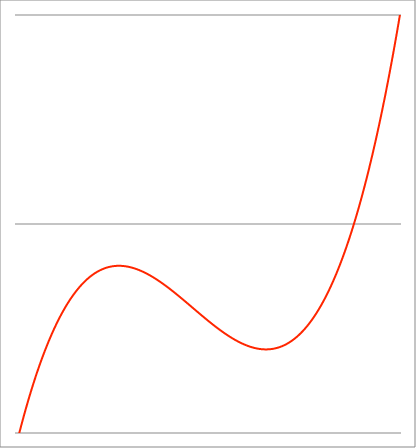
| Category | Series 1 |
|---|---|
| -3.4 | -1.062 |
| -3.397375 | -1.059 |
| -3.39475 | -1.055 |
| -3.392125 | -1.051 |
| -3.389499999999999 | -1.047 |
| -3.386874999999999 | -1.044 |
| -3.384249999999999 | -1.04 |
| -3.381624999999999 | -1.036 |
| -3.378999999999999 | -1.033 |
| -3.376374999999999 | -1.029 |
| -3.373749999999999 | -1.025 |
| -3.371124999999999 | -1.022 |
| -3.368499999999999 | -1.018 |
| -3.365874999999999 | -1.015 |
| -3.363249999999998 | -1.011 |
| -3.360624999999998 | -1.007 |
| -3.357999999999998 | -1.004 |
| -3.355374999999998 | -1 |
| -3.352749999999998 | -0.997 |
| -3.350124999999998 | -0.993 |
| -3.347499999999998 | -0.989 |
| -3.344874999999998 | -0.986 |
| -3.342249999999998 | -0.982 |
| -3.339624999999998 | -0.979 |
| -3.336999999999997 | -0.975 |
| -3.334374999999997 | -0.972 |
| -3.331749999999997 | -0.968 |
| -3.329124999999997 | -0.965 |
| -3.326499999999997 | -0.961 |
| -3.323874999999997 | -0.958 |
| -3.321249999999997 | -0.954 |
| -3.318624999999997 | -0.951 |
| -3.315999999999997 | -0.947 |
| -3.313374999999997 | -0.944 |
| -3.310749999999996 | -0.941 |
| -3.308124999999996 | -0.937 |
| -3.305499999999996 | -0.934 |
| -3.302874999999996 | -0.93 |
| -3.300249999999996 | -0.927 |
| -3.297624999999996 | -0.924 |
| -3.294999999999996 | -0.92 |
| -3.292374999999996 | -0.917 |
| -3.289749999999996 | -0.914 |
| -3.287124999999995 | -0.91 |
| -3.284499999999996 | -0.907 |
| -3.281874999999995 | -0.904 |
| -3.279249999999995 | -0.9 |
| -3.276624999999995 | -0.897 |
| -3.273999999999995 | -0.894 |
| -3.271374999999995 | -0.89 |
| -3.268749999999995 | -0.887 |
| -3.266124999999995 | -0.884 |
| -3.263499999999995 | -0.881 |
| -3.260874999999995 | -0.877 |
| -3.258249999999995 | -0.874 |
| -3.255624999999994 | -0.871 |
| -3.252999999999994 | -0.868 |
| -3.250374999999994 | -0.865 |
| -3.247749999999994 | -0.861 |
| -3.245124999999994 | -0.858 |
| -3.242499999999994 | -0.855 |
| -3.239874999999994 | -0.852 |
| -3.237249999999994 | -0.849 |
| -3.234624999999994 | -0.845 |
| -3.231999999999994 | -0.842 |
| -3.229374999999993 | -0.839 |
| -3.226749999999993 | -0.836 |
| -3.224124999999993 | -0.833 |
| -3.221499999999993 | -0.83 |
| -3.218874999999993 | -0.827 |
| -3.216249999999993 | -0.824 |
| -3.213624999999993 | -0.821 |
| -3.210999999999993 | -0.818 |
| -3.208374999999992 | -0.814 |
| -3.205749999999993 | -0.811 |
| -3.203124999999992 | -0.808 |
| -3.200499999999992 | -0.805 |
| -3.197874999999992 | -0.802 |
| -3.195249999999992 | -0.799 |
| -3.192624999999992 | -0.796 |
| -3.189999999999992 | -0.793 |
| -3.187374999999992 | -0.79 |
| -3.184749999999992 | -0.787 |
| -3.182124999999992 | -0.784 |
| -3.179499999999992 | -0.781 |
| -3.176874999999991 | -0.779 |
| -3.174249999999991 | -0.776 |
| -3.171624999999991 | -0.773 |
| -3.168999999999991 | -0.77 |
| -3.166374999999991 | -0.767 |
| -3.163749999999991 | -0.764 |
| -3.161124999999991 | -0.761 |
| -3.158499999999991 | -0.758 |
| -3.155874999999991 | -0.755 |
| -3.153249999999991 | -0.752 |
| -3.15062499999999 | -0.75 |
| -3.14799999999999 | -0.747 |
| -3.14537499999999 | -0.744 |
| -3.14274999999999 | -0.741 |
| -3.14012499999999 | -0.738 |
| -3.13749999999999 | -0.735 |
| -3.13487499999999 | -0.733 |
| -3.13224999999999 | -0.73 |
| -3.12962499999999 | -0.727 |
| -3.12699999999999 | -0.724 |
| -3.124374999999989 | -0.721 |
| -3.121749999999989 | -0.719 |
| -3.119124999999989 | -0.716 |
| -3.116499999999989 | -0.713 |
| -3.113874999999989 | -0.71 |
| -3.111249999999989 | -0.708 |
| -3.108624999999989 | -0.705 |
| -3.105999999999989 | -0.702 |
| -3.103374999999989 | -0.7 |
| -3.100749999999989 | -0.697 |
| -3.098124999999988 | -0.694 |
| -3.095499999999988 | -0.692 |
| -3.092874999999988 | -0.689 |
| -3.090249999999988 | -0.686 |
| -3.087624999999988 | -0.684 |
| -3.084999999999988 | -0.681 |
| -3.082374999999988 | -0.678 |
| -3.079749999999988 | -0.676 |
| -3.077124999999988 | -0.673 |
| -3.074499999999988 | -0.67 |
| -3.071874999999987 | -0.668 |
| -3.069249999999987 | -0.665 |
| -3.066624999999987 | -0.663 |
| -3.063999999999987 | -0.66 |
| -3.061374999999987 | -0.658 |
| -3.058749999999987 | -0.655 |
| -3.056124999999987 | -0.652 |
| -3.053499999999987 | -0.65 |
| -3.050874999999987 | -0.647 |
| -3.048249999999987 | -0.645 |
| -3.045624999999986 | -0.642 |
| -3.042999999999986 | -0.64 |
| -3.040374999999986 | -0.637 |
| -3.037749999999986 | -0.635 |
| -3.035124999999986 | -0.632 |
| -3.032499999999986 | -0.63 |
| -3.029874999999986 | -0.627 |
| -3.027249999999986 | -0.625 |
| -3.024624999999986 | -0.623 |
| -3.021999999999986 | -0.62 |
| -3.019374999999985 | -0.618 |
| -3.016749999999985 | -0.615 |
| -3.014124999999985 | -0.613 |
| -3.011499999999985 | -0.61 |
| -3.008874999999985 | -0.608 |
| -3.006249999999985 | -0.606 |
| -3.003624999999985 | -0.603 |
| -3.000999999999985 | -0.601 |
| -2.998374999999985 | -0.599 |
| -2.995749999999985 | -0.596 |
| -2.993124999999984 | -0.594 |
| -2.990499999999984 | -0.592 |
| -2.987874999999984 | -0.589 |
| -2.985249999999984 | -0.587 |
| -2.982624999999984 | -0.585 |
| -2.979999999999984 | -0.582 |
| -2.977374999999984 | -0.58 |
| -2.974749999999984 | -0.578 |
| -2.972124999999984 | -0.575 |
| -2.969499999999984 | -0.573 |
| -2.966874999999983 | -0.571 |
| -2.964249999999983 | -0.569 |
| -2.961624999999983 | -0.566 |
| -2.958999999999983 | -0.564 |
| -2.956374999999983 | -0.562 |
| -2.953749999999983 | -0.56 |
| -2.951124999999983 | -0.557 |
| -2.948499999999983 | -0.555 |
| -2.945874999999983 | -0.553 |
| -2.943249999999983 | -0.551 |
| -2.940624999999982 | -0.549 |
| -2.937999999999982 | -0.546 |
| -2.935374999999982 | -0.544 |
| -2.932749999999982 | -0.542 |
| -2.930124999999982 | -0.54 |
| -2.927499999999982 | -0.538 |
| -2.924874999999982 | -0.536 |
| -2.922249999999982 | -0.534 |
| -2.919624999999982 | -0.531 |
| -2.916999999999982 | -0.529 |
| -2.914374999999981 | -0.527 |
| -2.911749999999981 | -0.525 |
| -2.909124999999981 | -0.523 |
| -2.906499999999981 | -0.521 |
| -2.903874999999981 | -0.519 |
| -2.901249999999981 | -0.517 |
| -2.898624999999981 | -0.515 |
| -2.895999999999981 | -0.513 |
| -2.893374999999981 | -0.511 |
| -2.890749999999981 | -0.509 |
| -2.88812499999998 | -0.507 |
| -2.88549999999998 | -0.505 |
| -2.88287499999998 | -0.503 |
| -2.88024999999998 | -0.501 |
| -2.87762499999998 | -0.499 |
| -2.87499999999998 | -0.497 |
| -2.87237499999998 | -0.495 |
| -2.86974999999998 | -0.493 |
| -2.86712499999998 | -0.491 |
| -2.86449999999998 | -0.489 |
| -2.861874999999979 | -0.487 |
| -2.859249999999979 | -0.485 |
| -2.856624999999979 | -0.483 |
| -2.853999999999979 | -0.481 |
| -2.851374999999979 | -0.479 |
| -2.848749999999979 | -0.477 |
| -2.846124999999979 | -0.475 |
| -2.843499999999979 | -0.473 |
| -2.840874999999979 | -0.472 |
| -2.838249999999979 | -0.47 |
| -2.835624999999978 | -0.468 |
| -2.832999999999978 | -0.466 |
| -2.830374999999978 | -0.464 |
| -2.827749999999978 | -0.462 |
| -2.825124999999978 | -0.46 |
| -2.822499999999978 | -0.459 |
| -2.819874999999978 | -0.457 |
| -2.817249999999978 | -0.455 |
| -2.814624999999978 | -0.453 |
| -2.811999999999978 | -0.451 |
| -2.809374999999977 | -0.45 |
| -2.806749999999977 | -0.448 |
| -2.804124999999977 | -0.446 |
| -2.801499999999977 | -0.444 |
| -2.798874999999977 | -0.442 |
| -2.796249999999977 | -0.441 |
| -2.793624999999977 | -0.439 |
| -2.790999999999977 | -0.437 |
| -2.788374999999976 | -0.435 |
| -2.785749999999977 | -0.434 |
| -2.783124999999976 | -0.432 |
| -2.780499999999976 | -0.43 |
| -2.777874999999976 | -0.429 |
| -2.775249999999976 | -0.427 |
| -2.772624999999976 | -0.425 |
| -2.769999999999976 | -0.424 |
| -2.767374999999976 | -0.422 |
| -2.764749999999976 | -0.42 |
| -2.762124999999976 | -0.419 |
| -2.759499999999976 | -0.417 |
| -2.756874999999975 | -0.415 |
| -2.754249999999975 | -0.414 |
| -2.751624999999975 | -0.412 |
| -2.748999999999975 | -0.41 |
| -2.746374999999975 | -0.409 |
| -2.743749999999975 | -0.407 |
| -2.741124999999975 | -0.405 |
| -2.738499999999975 | -0.404 |
| -2.735874999999975 | -0.402 |
| -2.733249999999975 | -0.401 |
| -2.730624999999974 | -0.399 |
| -2.727999999999974 | -0.398 |
| -2.725374999999974 | -0.396 |
| -2.722749999999974 | -0.394 |
| -2.720124999999974 | -0.393 |
| -2.717499999999974 | -0.391 |
| -2.714874999999974 | -0.39 |
| -2.712249999999974 | -0.388 |
| -2.709624999999974 | -0.387 |
| -2.706999999999974 | -0.385 |
| -2.704374999999973 | -0.384 |
| -2.701749999999973 | -0.382 |
| -2.699124999999973 | -0.381 |
| -2.696499999999973 | -0.379 |
| -2.693874999999973 | -0.378 |
| -2.691249999999973 | -0.376 |
| -2.688624999999973 | -0.375 |
| -2.685999999999973 | -0.373 |
| -2.683374999999972 | -0.372 |
| -2.680749999999973 | -0.371 |
| -2.678124999999972 | -0.369 |
| -2.675499999999972 | -0.368 |
| -2.672874999999972 | -0.366 |
| -2.670249999999972 | -0.365 |
| -2.667624999999972 | -0.363 |
| -2.664999999999972 | -0.362 |
| -2.662374999999972 | -0.361 |
| -2.659749999999972 | -0.359 |
| -2.657124999999972 | -0.358 |
| -2.654499999999972 | -0.357 |
| -2.651874999999971 | -0.355 |
| -2.649249999999971 | -0.354 |
| -2.646624999999971 | -0.352 |
| -2.643999999999971 | -0.351 |
| -2.641374999999971 | -0.35 |
| -2.638749999999971 | -0.348 |
| -2.636124999999971 | -0.347 |
| -2.633499999999971 | -0.346 |
| -2.630874999999971 | -0.345 |
| -2.628249999999971 | -0.343 |
| -2.62562499999997 | -0.342 |
| -2.62299999999997 | -0.341 |
| -2.62037499999997 | -0.339 |
| -2.61774999999997 | -0.338 |
| -2.61512499999997 | -0.337 |
| -2.61249999999997 | -0.336 |
| -2.60987499999997 | -0.334 |
| -2.60724999999997 | -0.333 |
| -2.60462499999997 | -0.332 |
| -2.60199999999997 | -0.331 |
| -2.59937499999997 | -0.329 |
| -2.596749999999969 | -0.328 |
| -2.594124999999969 | -0.327 |
| -2.591499999999969 | -0.326 |
| -2.588874999999969 | -0.324 |
| -2.586249999999969 | -0.323 |
| -2.583624999999969 | -0.322 |
| -2.580999999999969 | -0.321 |
| -2.578374999999969 | -0.32 |
| -2.575749999999969 | -0.319 |
| -2.573124999999969 | -0.317 |
| -2.570499999999968 | -0.316 |
| -2.567874999999968 | -0.315 |
| -2.565249999999968 | -0.314 |
| -2.562624999999968 | -0.313 |
| -2.559999999999968 | -0.312 |
| -2.557374999999968 | -0.311 |
| -2.554749999999968 | -0.309 |
| -2.552124999999968 | -0.308 |
| -2.549499999999968 | -0.307 |
| -2.546874999999968 | -0.306 |
| -2.544249999999967 | -0.305 |
| -2.541624999999967 | -0.304 |
| -2.538999999999967 | -0.303 |
| -2.536374999999967 | -0.302 |
| -2.533749999999967 | -0.301 |
| -2.531124999999967 | -0.3 |
| -2.528499999999967 | -0.299 |
| -2.525874999999967 | -0.298 |
| -2.523249999999967 | -0.296 |
| -2.520624999999967 | -0.295 |
| -2.517999999999966 | -0.294 |
| -2.515374999999966 | -0.293 |
| -2.512749999999966 | -0.292 |
| -2.510124999999966 | -0.291 |
| -2.507499999999966 | -0.29 |
| -2.504874999999966 | -0.289 |
| -2.502249999999966 | -0.288 |
| -2.499624999999966 | -0.287 |
| -2.496999999999966 | -0.286 |
| -2.494374999999966 | -0.285 |
| -2.491749999999965 | -0.284 |
| -2.489124999999965 | -0.283 |
| -2.486499999999965 | -0.283 |
| -2.483874999999965 | -0.282 |
| -2.481249999999965 | -0.281 |
| -2.478624999999965 | -0.28 |
| -2.475999999999965 | -0.279 |
| -2.473374999999965 | -0.278 |
| -2.470749999999965 | -0.277 |
| -2.468124999999965 | -0.276 |
| -2.465499999999964 | -0.275 |
| -2.462874999999964 | -0.274 |
| -2.460249999999964 | -0.273 |
| -2.457624999999964 | -0.272 |
| -2.454999999999964 | -0.272 |
| -2.452374999999964 | -0.271 |
| -2.449749999999964 | -0.27 |
| -2.447124999999964 | -0.269 |
| -2.444499999999964 | -0.268 |
| -2.441874999999964 | -0.267 |
| -2.439249999999963 | -0.266 |
| -2.436624999999963 | -0.266 |
| -2.433999999999963 | -0.265 |
| -2.431374999999963 | -0.264 |
| -2.428749999999963 | -0.263 |
| -2.426124999999963 | -0.262 |
| -2.423499999999963 | -0.261 |
| -2.420874999999963 | -0.261 |
| -2.418249999999963 | -0.26 |
| -2.415624999999963 | -0.259 |
| -2.412999999999962 | -0.258 |
| -2.410374999999962 | -0.257 |
| -2.407749999999962 | -0.257 |
| -2.405124999999962 | -0.256 |
| -2.402499999999962 | -0.255 |
| -2.399874999999962 | -0.254 |
| -2.397249999999962 | -0.254 |
| -2.394624999999962 | -0.253 |
| -2.391999999999962 | -0.252 |
| -2.389374999999962 | -0.251 |
| -2.386749999999961 | -0.251 |
| -2.384124999999961 | -0.25 |
| -2.381499999999961 | -0.249 |
| -2.378874999999961 | -0.249 |
| -2.376249999999961 | -0.248 |
| -2.373624999999961 | -0.247 |
| -2.370999999999961 | -0.246 |
| -2.368374999999961 | -0.246 |
| -2.365749999999961 | -0.245 |
| -2.363124999999961 | -0.244 |
| -2.36049999999996 | -0.244 |
| -2.35787499999996 | -0.243 |
| -2.35524999999996 | -0.242 |
| -2.35262499999996 | -0.242 |
| -2.34999999999996 | -0.241 |
| -2.34737499999996 | -0.24 |
| -2.34474999999996 | -0.24 |
| -2.34212499999996 | -0.239 |
| -2.33949999999996 | -0.238 |
| -2.33687499999996 | -0.238 |
| -2.334249999999959 | -0.237 |
| -2.331624999999959 | -0.237 |
| -2.328999999999959 | -0.236 |
| -2.326374999999959 | -0.235 |
| -2.323749999999959 | -0.235 |
| -2.321124999999959 | -0.234 |
| -2.318499999999959 | -0.234 |
| -2.315874999999959 | -0.233 |
| -2.313249999999959 | -0.233 |
| -2.310624999999959 | -0.232 |
| -2.307999999999958 | -0.231 |
| -2.305374999999958 | -0.231 |
| -2.302749999999958 | -0.23 |
| -2.300124999999958 | -0.23 |
| -2.297499999999958 | -0.229 |
| -2.294874999999958 | -0.229 |
| -2.292249999999958 | -0.228 |
| -2.289624999999958 | -0.228 |
| -2.286999999999958 | -0.227 |
| -2.284374999999957 | -0.227 |
| -2.281749999999958 | -0.226 |
| -2.279124999999957 | -0.226 |
| -2.276499999999957 | -0.225 |
| -2.273874999999957 | -0.225 |
| -2.271249999999957 | -0.224 |
| -2.268624999999957 | -0.224 |
| -2.265999999999957 | -0.223 |
| -2.263374999999956 | -0.223 |
| -2.260749999999957 | -0.222 |
| -2.258124999999956 | -0.222 |
| -2.255499999999957 | -0.221 |
| -2.252874999999956 | -0.221 |
| -2.250249999999956 | -0.22 |
| -2.247624999999956 | -0.22 |
| -2.244999999999956 | -0.219 |
| -2.242374999999956 | -0.219 |
| -2.239749999999956 | -0.219 |
| -2.237124999999956 | -0.218 |
| -2.234499999999956 | -0.218 |
| -2.231874999999956 | -0.217 |
| -2.229249999999956 | -0.217 |
| -2.226624999999955 | -0.217 |
| -2.223999999999955 | -0.216 |
| -2.221374999999955 | -0.216 |
| -2.218749999999955 | -0.215 |
| -2.216124999999955 | -0.215 |
| -2.213499999999955 | -0.215 |
| -2.210874999999955 | -0.214 |
| -2.208249999999955 | -0.214 |
| -2.205624999999955 | -0.214 |
| -2.202999999999955 | -0.213 |
| -2.200374999999954 | -0.213 |
| -2.197749999999954 | -0.213 |
| -2.195124999999954 | -0.212 |
| -2.192499999999954 | -0.212 |
| -2.189874999999954 | -0.212 |
| -2.187249999999954 | -0.211 |
| -2.184624999999954 | -0.211 |
| -2.181999999999954 | -0.211 |
| -2.179374999999954 | -0.21 |
| -2.176749999999954 | -0.21 |
| -2.174124999999953 | -0.21 |
| -2.171499999999953 | -0.209 |
| -2.168874999999953 | -0.209 |
| -2.166249999999953 | -0.209 |
| -2.163624999999953 | -0.208 |
| -2.160999999999953 | -0.208 |
| -2.158374999999953 | -0.208 |
| -2.155749999999953 | -0.208 |
| -2.153124999999952 | -0.207 |
| -2.150499999999953 | -0.207 |
| -2.147874999999952 | -0.207 |
| -2.145249999999952 | -0.207 |
| -2.142624999999952 | -0.206 |
| -2.139999999999952 | -0.206 |
| -2.137374999999952 | -0.206 |
| -2.134749999999952 | -0.206 |
| -2.132124999999952 | -0.205 |
| -2.129499999999952 | -0.205 |
| -2.126874999999952 | -0.205 |
| -2.124249999999952 | -0.205 |
| -2.121624999999951 | -0.205 |
| -2.118999999999951 | -0.204 |
| -2.116374999999951 | -0.204 |
| -2.113749999999951 | -0.204 |
| -2.111124999999951 | -0.204 |
| -2.108499999999951 | -0.204 |
| -2.105874999999951 | -0.203 |
| -2.103249999999951 | -0.203 |
| -2.100624999999951 | -0.203 |
| -2.097999999999951 | -0.203 |
| -2.09537499999995 | -0.203 |
| -2.09274999999995 | -0.203 |
| -2.09012499999995 | -0.203 |
| -2.08749999999995 | -0.202 |
| -2.08487499999995 | -0.202 |
| -2.08224999999995 | -0.202 |
| -2.07962499999995 | -0.202 |
| -2.07699999999995 | -0.202 |
| -2.07437499999995 | -0.202 |
| -2.07174999999995 | -0.202 |
| -2.069124999999949 | -0.201 |
| -2.066499999999949 | -0.201 |
| -2.063874999999949 | -0.201 |
| -2.061249999999949 | -0.201 |
| -2.058624999999949 | -0.201 |
| -2.055999999999949 | -0.201 |
| -2.053374999999949 | -0.201 |
| -2.050749999999949 | -0.201 |
| -2.048124999999949 | -0.201 |
| -2.045499999999949 | -0.201 |
| -2.042874999999948 | -0.201 |
| -2.040249999999948 | -0.2 |
| -2.037624999999948 | -0.2 |
| -2.034999999999948 | -0.2 |
| -2.032374999999948 | -0.2 |
| -2.029749999999948 | -0.2 |
| -2.027124999999948 | -0.2 |
| -2.024499999999948 | -0.2 |
| -2.021874999999948 | -0.2 |
| -2.019249999999948 | -0.2 |
| -2.016624999999947 | -0.2 |
| -2.013999999999947 | -0.2 |
| -2.011374999999947 | -0.2 |
| -2.008749999999947 | -0.2 |
| -2.006124999999947 | -0.2 |
| -2.003499999999947 | -0.2 |
| -2.000874999999947 | -0.2 |
| -1.998249999999947 | -0.2 |
| -1.995624999999947 | -0.2 |
| -1.992999999999947 | -0.2 |
| -1.990374999999946 | -0.2 |
| -1.987749999999946 | -0.2 |
| -1.985124999999946 | -0.2 |
| -1.982499999999946 | -0.2 |
| -1.979874999999946 | -0.2 |
| -1.977249999999946 | -0.2 |
| -1.974624999999946 | -0.2 |
| -1.971999999999946 | -0.2 |
| -1.969374999999946 | -0.2 |
| -1.966749999999946 | -0.2 |
| -1.964124999999945 | -0.2 |
| -1.961499999999945 | -0.2 |
| -1.958874999999945 | -0.201 |
| -1.956249999999945 | -0.201 |
| -1.953624999999945 | -0.201 |
| -1.950999999999945 | -0.201 |
| -1.948374999999945 | -0.201 |
| -1.945749999999945 | -0.201 |
| -1.943124999999945 | -0.201 |
| -1.940499999999945 | -0.201 |
| -1.937874999999944 | -0.201 |
| -1.935249999999944 | -0.201 |
| -1.932624999999944 | -0.201 |
| -1.929999999999944 | -0.201 |
| -1.927374999999944 | -0.202 |
| -1.924749999999944 | -0.202 |
| -1.922124999999944 | -0.202 |
| -1.919499999999944 | -0.202 |
| -1.916874999999944 | -0.202 |
| -1.914249999999944 | -0.202 |
| -1.911624999999943 | -0.202 |
| -1.908999999999943 | -0.202 |
| -1.906374999999943 | -0.203 |
| -1.903749999999943 | -0.203 |
| -1.901124999999943 | -0.203 |
| -1.898499999999943 | -0.203 |
| -1.895874999999943 | -0.203 |
| -1.893249999999943 | -0.203 |
| -1.890624999999943 | -0.203 |
| -1.887999999999943 | -0.204 |
| -1.885374999999942 | -0.204 |
| -1.882749999999942 | -0.204 |
| -1.880124999999942 | -0.204 |
| -1.877499999999942 | -0.204 |
| -1.874874999999942 | -0.205 |
| -1.872249999999942 | -0.205 |
| -1.869624999999942 | -0.205 |
| -1.866999999999942 | -0.205 |
| -1.864374999999942 | -0.205 |
| -1.861749999999942 | -0.205 |
| -1.859124999999941 | -0.206 |
| -1.856499999999941 | -0.206 |
| -1.853874999999941 | -0.206 |
| -1.851249999999941 | -0.206 |
| -1.848624999999941 | -0.207 |
| -1.845999999999941 | -0.207 |
| -1.843374999999941 | -0.207 |
| -1.840749999999941 | -0.207 |
| -1.838124999999941 | -0.207 |
| -1.835499999999941 | -0.208 |
| -1.83287499999994 | -0.208 |
| -1.83024999999994 | -0.208 |
| -1.82762499999994 | -0.208 |
| -1.82499999999994 | -0.209 |
| -1.82237499999994 | -0.209 |
| -1.81974999999994 | -0.209 |
| -1.81712499999994 | -0.209 |
| -1.81449999999994 | -0.21 |
| -1.81187499999994 | -0.21 |
| -1.80924999999994 | -0.21 |
| -1.806624999999939 | -0.21 |
| -1.803999999999939 | -0.211 |
| -1.801374999999939 | -0.211 |
| -1.79874999999994 | -0.211 |
| -1.79612499999994 | -0.212 |
| -1.793499999999939 | -0.212 |
| -1.790874999999939 | -0.212 |
| -1.788249999999939 | -0.213 |
| -1.785624999999939 | -0.213 |
| -1.782999999999939 | -0.213 |
| -1.780374999999938 | -0.213 |
| -1.777749999999938 | -0.214 |
| -1.775124999999938 | -0.214 |
| -1.772499999999938 | -0.214 |
| -1.769874999999938 | -0.215 |
| -1.767249999999938 | -0.215 |
| -1.764624999999938 | -0.215 |
| -1.761999999999938 | -0.216 |
| -1.759374999999938 | -0.216 |
| -1.756749999999938 | -0.216 |
| -1.754124999999937 | -0.217 |
| -1.751499999999937 | -0.217 |
| -1.748874999999937 | -0.217 |
| -1.746249999999937 | -0.218 |
| -1.743624999999937 | -0.218 |
| -1.740999999999937 | -0.218 |
| -1.738374999999937 | -0.219 |
| -1.735749999999937 | -0.219 |
| -1.733124999999937 | -0.219 |
| -1.730499999999937 | -0.22 |
| -1.727874999999936 | -0.22 |
| -1.725249999999936 | -0.221 |
| -1.722624999999936 | -0.221 |
| -1.719999999999936 | -0.221 |
| -1.717374999999936 | -0.222 |
| -1.714749999999936 | -0.222 |
| -1.712124999999936 | -0.222 |
| -1.709499999999936 | -0.223 |
| -1.706874999999936 | -0.223 |
| -1.704249999999936 | -0.224 |
| -1.701624999999935 | -0.224 |
| -1.698999999999935 | -0.224 |
| -1.696374999999935 | -0.225 |
| -1.693749999999935 | -0.225 |
| -1.691124999999935 | -0.226 |
| -1.688499999999935 | -0.226 |
| -1.685874999999935 | -0.227 |
| -1.683249999999935 | -0.227 |
| -1.680624999999935 | -0.227 |
| -1.677999999999935 | -0.228 |
| -1.675374999999934 | -0.228 |
| -1.672749999999934 | -0.229 |
| -1.670124999999934 | -0.229 |
| -1.667499999999934 | -0.229 |
| -1.664874999999934 | -0.23 |
| -1.662249999999934 | -0.23 |
| -1.659624999999934 | -0.231 |
| -1.656999999999934 | -0.231 |
| -1.654374999999934 | -0.232 |
| -1.651749999999934 | -0.232 |
| -1.649124999999933 | -0.233 |
| -1.646499999999933 | -0.233 |
| -1.643874999999933 | -0.234 |
| -1.641249999999933 | -0.234 |
| -1.638624999999933 | -0.234 |
| -1.635999999999933 | -0.235 |
| -1.633374999999933 | -0.235 |
| -1.630749999999933 | -0.236 |
| -1.628124999999933 | -0.236 |
| -1.625499999999933 | -0.237 |
| -1.622874999999932 | -0.237 |
| -1.620249999999932 | -0.238 |
| -1.617624999999932 | -0.238 |
| -1.614999999999932 | -0.239 |
| -1.612374999999932 | -0.239 |
| -1.609749999999932 | -0.24 |
| -1.607124999999932 | -0.24 |
| -1.604499999999932 | -0.241 |
| -1.601874999999932 | -0.241 |
| -1.599249999999932 | -0.242 |
| -1.596624999999932 | -0.242 |
| -1.593999999999931 | -0.243 |
| -1.591374999999931 | -0.243 |
| -1.588749999999931 | -0.244 |
| -1.586124999999931 | -0.244 |
| -1.583499999999931 | -0.245 |
| -1.580874999999931 | -0.245 |
| -1.578249999999931 | -0.246 |
| -1.575624999999931 | -0.246 |
| -1.572999999999931 | -0.247 |
| -1.570374999999931 | -0.247 |
| -1.56774999999993 | -0.248 |
| -1.56512499999993 | -0.249 |
| -1.56249999999993 | -0.249 |
| -1.55987499999993 | -0.25 |
| -1.55724999999993 | -0.25 |
| -1.55462499999993 | -0.251 |
| -1.55199999999993 | -0.251 |
| -1.54937499999993 | -0.252 |
| -1.54674999999993 | -0.252 |
| -1.54412499999993 | -0.253 |
| -1.541499999999929 | -0.253 |
| -1.538874999999929 | -0.254 |
| -1.536249999999929 | -0.255 |
| -1.533624999999929 | -0.255 |
| -1.530999999999929 | -0.256 |
| -1.528374999999929 | -0.256 |
| -1.525749999999929 | -0.257 |
| -1.523124999999929 | -0.257 |
| -1.520499999999929 | -0.258 |
| -1.517874999999929 | -0.259 |
| -1.515249999999928 | -0.259 |
| -1.512624999999928 | -0.26 |
| -1.509999999999928 | -0.26 |
| -1.507374999999928 | -0.261 |
| -1.504749999999928 | -0.261 |
| -1.502124999999928 | -0.262 |
| -1.499499999999928 | -0.263 |
| -1.496874999999928 | -0.263 |
| -1.494249999999928 | -0.264 |
| -1.491624999999928 | -0.264 |
| -1.488999999999927 | -0.265 |
| -1.486374999999927 | -0.266 |
| -1.483749999999927 | -0.266 |
| -1.481124999999927 | -0.267 |
| -1.478499999999927 | -0.267 |
| -1.475874999999927 | -0.268 |
| -1.473249999999927 | -0.269 |
| -1.470624999999927 | -0.269 |
| -1.467999999999927 | -0.27 |
| -1.465374999999927 | -0.27 |
| -1.462749999999926 | -0.271 |
| -1.460124999999926 | -0.272 |
| -1.457499999999926 | -0.272 |
| -1.454874999999926 | -0.273 |
| -1.452249999999926 | -0.274 |
| -1.449624999999926 | -0.274 |
| -1.446999999999926 | -0.275 |
| -1.444374999999926 | -0.275 |
| -1.441749999999926 | -0.276 |
| -1.439124999999926 | -0.277 |
| -1.436499999999925 | -0.277 |
| -1.433874999999925 | -0.278 |
| -1.431249999999925 | -0.279 |
| -1.428624999999925 | -0.279 |
| -1.425999999999925 | -0.28 |
| -1.423374999999925 | -0.281 |
| -1.420749999999925 | -0.281 |
| -1.418124999999925 | -0.282 |
| -1.415499999999925 | -0.283 |
| -1.412874999999925 | -0.283 |
| -1.410249999999924 | -0.284 |
| -1.407624999999924 | -0.284 |
| -1.404999999999924 | -0.285 |
| -1.402374999999924 | -0.286 |
| -1.399749999999924 | -0.286 |
| -1.397124999999924 | -0.287 |
| -1.394499999999924 | -0.288 |
| -1.391874999999924 | -0.288 |
| -1.389249999999924 | -0.289 |
| -1.386624999999924 | -0.29 |
| -1.383999999999923 | -0.29 |
| -1.381374999999923 | -0.291 |
| -1.378749999999923 | -0.292 |
| -1.376124999999923 | -0.292 |
| -1.373499999999923 | -0.293 |
| -1.370874999999923 | -0.294 |
| -1.368249999999923 | -0.295 |
| -1.365624999999923 | -0.295 |
| -1.362999999999923 | -0.296 |
| -1.360374999999923 | -0.297 |
| -1.357749999999922 | -0.297 |
| -1.355124999999922 | -0.298 |
| -1.352499999999922 | -0.299 |
| -1.349874999999922 | -0.299 |
| -1.347249999999922 | -0.3 |
| -1.344624999999922 | -0.301 |
| -1.341999999999922 | -0.301 |
| -1.339374999999922 | -0.302 |
| -1.336749999999922 | -0.303 |
| -1.334124999999922 | -0.303 |
| -1.331499999999921 | -0.304 |
| -1.328874999999921 | -0.305 |
| -1.326249999999921 | -0.306 |
| -1.323624999999921 | -0.306 |
| -1.320999999999921 | -0.307 |
| -1.318374999999921 | -0.308 |
| -1.315749999999921 | -0.308 |
| -1.313124999999921 | -0.309 |
| -1.310499999999921 | -0.31 |
| -1.307874999999921 | -0.311 |
| -1.30524999999992 | -0.311 |
| -1.30262499999992 | -0.312 |
| -1.29999999999992 | -0.313 |
| -1.29737499999992 | -0.313 |
| -1.29474999999992 | -0.314 |
| -1.29212499999992 | -0.315 |
| -1.28949999999992 | -0.316 |
| -1.28687499999992 | -0.316 |
| -1.28424999999992 | -0.317 |
| -1.28162499999992 | -0.318 |
| -1.27899999999992 | -0.318 |
| -1.276374999999919 | -0.319 |
| -1.273749999999919 | -0.32 |
| -1.271124999999919 | -0.321 |
| -1.268499999999919 | -0.321 |
| -1.265874999999919 | -0.322 |
| -1.263249999999919 | -0.323 |
| -1.260624999999919 | -0.324 |
| -1.257999999999919 | -0.324 |
| -1.255374999999919 | -0.325 |
| -1.252749999999919 | -0.326 |
| -1.250124999999918 | -0.327 |
| -1.247499999999918 | -0.327 |
| -1.244874999999918 | -0.328 |
| -1.242249999999918 | -0.329 |
| -1.239624999999918 | -0.329 |
| -1.236999999999918 | -0.33 |
| -1.234374999999918 | -0.331 |
| -1.231749999999918 | -0.332 |
| -1.229124999999918 | -0.332 |
| -1.226499999999918 | -0.333 |
| -1.223874999999917 | -0.334 |
| -1.221249999999917 | -0.335 |
| -1.218624999999917 | -0.335 |
| -1.215999999999917 | -0.336 |
| -1.213374999999917 | -0.337 |
| -1.210749999999917 | -0.338 |
| -1.208124999999917 | -0.338 |
| -1.205499999999917 | -0.339 |
| -1.202874999999917 | -0.34 |
| -1.200249999999917 | -0.341 |
| -1.197624999999916 | -0.341 |
| -1.194999999999916 | -0.342 |
| -1.192374999999916 | -0.343 |
| -1.189749999999916 | -0.344 |
| -1.187124999999916 | -0.345 |
| -1.184499999999916 | -0.345 |
| -1.181874999999916 | -0.346 |
| -1.179249999999916 | -0.347 |
| -1.176624999999916 | -0.348 |
| -1.173999999999916 | -0.348 |
| -1.171374999999915 | -0.349 |
| -1.168749999999915 | -0.35 |
| -1.166124999999915 | -0.351 |
| -1.163499999999915 | -0.351 |
| -1.160874999999915 | -0.352 |
| -1.158249999999915 | -0.353 |
| -1.155624999999915 | -0.354 |
| -1.152999999999915 | -0.354 |
| -1.150374999999915 | -0.355 |
| -1.147749999999915 | -0.356 |
| -1.145124999999914 | -0.357 |
| -1.142499999999914 | -0.358 |
| -1.139874999999914 | -0.358 |
| -1.137249999999914 | -0.359 |
| -1.134624999999914 | -0.36 |
| -1.131999999999914 | -0.361 |
| -1.129374999999914 | -0.361 |
| -1.126749999999914 | -0.362 |
| -1.124124999999914 | -0.363 |
| -1.121499999999914 | -0.364 |
| -1.118874999999913 | -0.365 |
| -1.116249999999913 | -0.365 |
| -1.113624999999913 | -0.366 |
| -1.110999999999913 | -0.367 |
| -1.108374999999913 | -0.368 |
| -1.105749999999913 | -0.368 |
| -1.103124999999913 | -0.369 |
| -1.100499999999913 | -0.37 |
| -1.097874999999913 | -0.371 |
| -1.095249999999913 | -0.372 |
| -1.092624999999912 | -0.372 |
| -1.089999999999912 | -0.373 |
| -1.087374999999912 | -0.374 |
| -1.084749999999912 | -0.375 |
| -1.082124999999912 | -0.375 |
| -1.079499999999912 | -0.376 |
| -1.076874999999912 | -0.377 |
| -1.074249999999912 | -0.378 |
| -1.071624999999912 | -0.379 |
| -1.068999999999912 | -0.379 |
| -1.066374999999911 | -0.38 |
| -1.063749999999911 | -0.381 |
| -1.061124999999911 | -0.382 |
| -1.058499999999911 | -0.382 |
| -1.055874999999911 | -0.383 |
| -1.053249999999911 | -0.384 |
| -1.050624999999911 | -0.385 |
| -1.047999999999911 | -0.386 |
| -1.045374999999911 | -0.386 |
| -1.042749999999911 | -0.387 |
| -1.04012499999991 | -0.388 |
| -1.03749999999991 | -0.389 |
| -1.03487499999991 | -0.39 |
| -1.03224999999991 | -0.39 |
| -1.02962499999991 | -0.391 |
| -1.02699999999991 | -0.392 |
| -1.02437499999991 | -0.393 |
| -1.02174999999991 | -0.393 |
| -1.01912499999991 | -0.394 |
| -1.01649999999991 | -0.395 |
| -1.013874999999909 | -0.396 |
| -1.011249999999909 | -0.397 |
| -1.008624999999909 | -0.397 |
| -1.005999999999909 | -0.398 |
| -1.003374999999909 | -0.399 |
| -1.000749999999909 | -0.4 |
| -0.998124999999909 | -0.401 |
| -0.995499999999909 | -0.401 |
| -0.992874999999909 | -0.402 |
| -0.990249999999909 | -0.403 |
| -0.987624999999909 | -0.404 |
| -0.984999999999909 | -0.404 |
| -0.982374999999909 | -0.405 |
| -0.979749999999909 | -0.406 |
| -0.977124999999909 | -0.407 |
| -0.974499999999909 | -0.408 |
| -0.971874999999909 | -0.408 |
| -0.969249999999909 | -0.409 |
| -0.966624999999909 | -0.41 |
| -0.963999999999909 | -0.411 |
| -0.961374999999909 | -0.412 |
| -0.958749999999909 | -0.412 |
| -0.956124999999909 | -0.413 |
| -0.953499999999909 | -0.414 |
| -0.950874999999909 | -0.415 |
| -0.948249999999909 | -0.416 |
| -0.945624999999909 | -0.416 |
| -0.942999999999909 | -0.417 |
| -0.940374999999909 | -0.418 |
| -0.937749999999909 | -0.419 |
| -0.935124999999909 | -0.419 |
| -0.932499999999909 | -0.42 |
| -0.929874999999909 | -0.421 |
| -0.927249999999909 | -0.422 |
| -0.924624999999909 | -0.423 |
| -0.921999999999909 | -0.423 |
| -0.919374999999909 | -0.424 |
| -0.916749999999909 | -0.425 |
| -0.914124999999909 | -0.426 |
| -0.911499999999909 | -0.426 |
| -0.908874999999909 | -0.427 |
| -0.906249999999909 | -0.428 |
| -0.903624999999909 | -0.429 |
| -0.900999999999909 | -0.43 |
| -0.898374999999909 | -0.43 |
| -0.895749999999909 | -0.431 |
| -0.893124999999909 | -0.432 |
| -0.890499999999909 | -0.433 |
| -0.887874999999909 | -0.433 |
| -0.885249999999909 | -0.434 |
| -0.882624999999909 | -0.435 |
| -0.879999999999909 | -0.436 |
| -0.877374999999909 | -0.437 |
| -0.874749999999909 | -0.437 |
| -0.87212499999991 | -0.438 |
| -0.86949999999991 | -0.439 |
| -0.86687499999991 | -0.44 |
| -0.86424999999991 | -0.44 |
| -0.86162499999991 | -0.441 |
| -0.85899999999991 | -0.442 |
| -0.85637499999991 | -0.443 |
| -0.85374999999991 | -0.444 |
| -0.85112499999991 | -0.444 |
| -0.84849999999991 | -0.445 |
| -0.84587499999991 | -0.446 |
| -0.84324999999991 | -0.447 |
| -0.84062499999991 | -0.447 |
| -0.83799999999991 | -0.448 |
| -0.83537499999991 | -0.449 |
| -0.83274999999991 | -0.45 |
| -0.83012499999991 | -0.45 |
| -0.82749999999991 | -0.451 |
| -0.82487499999991 | -0.452 |
| -0.82224999999991 | -0.453 |
| -0.81962499999991 | -0.454 |
| -0.81699999999991 | -0.454 |
| -0.81437499999991 | -0.455 |
| -0.81174999999991 | -0.456 |
| -0.80912499999991 | -0.457 |
| -0.80649999999991 | -0.457 |
| -0.80387499999991 | -0.458 |
| -0.80124999999991 | -0.459 |
| -0.79862499999991 | -0.46 |
| -0.79599999999991 | -0.46 |
| -0.79337499999991 | -0.461 |
| -0.79074999999991 | -0.462 |
| -0.78812499999991 | -0.463 |
| -0.78549999999991 | -0.463 |
| -0.78287499999991 | -0.464 |
| -0.78024999999991 | -0.465 |
| -0.77762499999991 | -0.466 |
| -0.77499999999991 | -0.466 |
| -0.77237499999991 | -0.467 |
| -0.76974999999991 | -0.468 |
| -0.76712499999991 | -0.469 |
| -0.76449999999991 | -0.469 |
| -0.76187499999991 | -0.47 |
| -0.75924999999991 | -0.471 |
| -0.75662499999991 | -0.472 |
| -0.75399999999991 | -0.472 |
| -0.75137499999991 | -0.473 |
| -0.74874999999991 | -0.474 |
| -0.74612499999991 | -0.475 |
| -0.74349999999991 | -0.475 |
| -0.74087499999991 | -0.476 |
| -0.73824999999991 | -0.477 |
| -0.73562499999991 | -0.477 |
| -0.73299999999991 | -0.478 |
| -0.73037499999991 | -0.479 |
| -0.72774999999991 | -0.48 |
| -0.72512499999991 | -0.48 |
| -0.72249999999991 | -0.481 |
| -0.71987499999991 | -0.482 |
| -0.71724999999991 | -0.483 |
| -0.71462499999991 | -0.483 |
| -0.71199999999991 | -0.484 |
| -0.70937499999991 | -0.485 |
| -0.70674999999991 | -0.485 |
| -0.70412499999991 | -0.486 |
| -0.70149999999991 | -0.487 |
| -0.69887499999991 | -0.488 |
| -0.69624999999991 | -0.488 |
| -0.69362499999991 | -0.489 |
| -0.69099999999991 | -0.49 |
| -0.68837499999991 | -0.49 |
| -0.68574999999991 | -0.491 |
| -0.68312499999991 | -0.492 |
| -0.68049999999991 | -0.493 |
| -0.67787499999991 | -0.493 |
| -0.67524999999991 | -0.494 |
| -0.67262499999991 | -0.495 |
| -0.66999999999991 | -0.495 |
| -0.66737499999991 | -0.496 |
| -0.66474999999991 | -0.497 |
| -0.66212499999991 | -0.498 |
| -0.65949999999991 | -0.498 |
| -0.65687499999991 | -0.499 |
| -0.65424999999991 | -0.5 |
| -0.65162499999991 | -0.5 |
| -0.64899999999991 | -0.501 |
| -0.64637499999991 | -0.502 |
| -0.64374999999991 | -0.502 |
| -0.64112499999991 | -0.503 |
| -0.63849999999991 | -0.504 |
| -0.63587499999991 | -0.504 |
| -0.633249999999911 | -0.505 |
| -0.630624999999911 | -0.506 |
| -0.627999999999911 | -0.506 |
| -0.625374999999911 | -0.507 |
| -0.622749999999911 | -0.508 |
| -0.620124999999911 | -0.508 |
| -0.617499999999911 | -0.509 |
| -0.614874999999911 | -0.51 |
| -0.612249999999911 | -0.51 |
| -0.609624999999911 | -0.511 |
| -0.606999999999911 | -0.512 |
| -0.604374999999911 | -0.512 |
| -0.601749999999911 | -0.513 |
| -0.599124999999911 | -0.514 |
| -0.596499999999911 | -0.514 |
| -0.593874999999911 | -0.515 |
| -0.591249999999911 | -0.516 |
| -0.588624999999911 | -0.516 |
| -0.585999999999911 | -0.517 |
| -0.583374999999911 | -0.518 |
| -0.580749999999911 | -0.518 |
| -0.578124999999911 | -0.519 |
| -0.575499999999911 | -0.52 |
| -0.572874999999911 | -0.52 |
| -0.570249999999911 | -0.521 |
| -0.567624999999911 | -0.522 |
| -0.564999999999911 | -0.522 |
| -0.562374999999911 | -0.523 |
| -0.559749999999911 | -0.524 |
| -0.557124999999911 | -0.524 |
| -0.554499999999911 | -0.525 |
| -0.551874999999911 | -0.525 |
| -0.549249999999911 | -0.526 |
| -0.546624999999911 | -0.527 |
| -0.543999999999911 | -0.527 |
| -0.541374999999911 | -0.528 |
| -0.538749999999911 | -0.529 |
| -0.536124999999911 | -0.529 |
| -0.533499999999911 | -0.53 |
| -0.530874999999911 | -0.53 |
| -0.528249999999911 | -0.531 |
| -0.525624999999911 | -0.532 |
| -0.522999999999911 | -0.532 |
| -0.520374999999911 | -0.533 |
| -0.517749999999911 | -0.533 |
| -0.515124999999911 | -0.534 |
| -0.512499999999911 | -0.535 |
| -0.509874999999911 | -0.535 |
| -0.507249999999911 | -0.536 |
| -0.504624999999911 | -0.536 |
| -0.501999999999911 | -0.537 |
| -0.499374999999911 | -0.538 |
| -0.496749999999911 | -0.538 |
| -0.494124999999911 | -0.539 |
| -0.491499999999911 | -0.539 |
| -0.488874999999911 | -0.54 |
| -0.486249999999911 | -0.541 |
| -0.483624999999911 | -0.541 |
| -0.480999999999911 | -0.542 |
| -0.478374999999911 | -0.542 |
| -0.475749999999911 | -0.543 |
| -0.473124999999911 | -0.543 |
| -0.470499999999911 | -0.544 |
| -0.467874999999911 | -0.545 |
| -0.465249999999911 | -0.545 |
| -0.462624999999911 | -0.546 |
| -0.459999999999911 | -0.546 |
| -0.457374999999911 | -0.547 |
| -0.454749999999911 | -0.547 |
| -0.452124999999911 | -0.548 |
| -0.449499999999911 | -0.548 |
| -0.446874999999911 | -0.549 |
| -0.444249999999911 | -0.55 |
| -0.441624999999911 | -0.55 |
| -0.438999999999911 | -0.551 |
| -0.436374999999911 | -0.551 |
| -0.433749999999911 | -0.552 |
| -0.431124999999911 | -0.552 |
| -0.428499999999911 | -0.553 |
| -0.425874999999911 | -0.553 |
| -0.423249999999912 | -0.554 |
| -0.420624999999912 | -0.554 |
| -0.417999999999912 | -0.555 |
| -0.415374999999912 | -0.555 |
| -0.412749999999912 | -0.556 |
| -0.410124999999912 | -0.556 |
| -0.407499999999912 | -0.557 |
| -0.404874999999912 | -0.557 |
| -0.402249999999912 | -0.558 |
| -0.399624999999912 | -0.558 |
| -0.396999999999912 | -0.559 |
| -0.394374999999912 | -0.559 |
| -0.391749999999912 | -0.56 |
| -0.389124999999912 | -0.56 |
| -0.386499999999912 | -0.561 |
| -0.383874999999912 | -0.561 |
| -0.381249999999912 | -0.562 |
| -0.378624999999912 | -0.562 |
| -0.375999999999912 | -0.563 |
| -0.373374999999912 | -0.563 |
| -0.370749999999912 | -0.564 |
| -0.368124999999912 | -0.564 |
| -0.365499999999912 | -0.565 |
| -0.362874999999912 | -0.565 |
| -0.360249999999912 | -0.566 |
| -0.357624999999912 | -0.566 |
| -0.354999999999912 | -0.567 |
| -0.352374999999912 | -0.567 |
| -0.349749999999912 | -0.568 |
| -0.347124999999912 | -0.568 |
| -0.344499999999912 | -0.568 |
| -0.341874999999912 | -0.569 |
| -0.339249999999912 | -0.569 |
| -0.336624999999912 | -0.57 |
| -0.333999999999912 | -0.57 |
| -0.331374999999912 | -0.571 |
| -0.328749999999912 | -0.571 |
| -0.326124999999912 | -0.572 |
| -0.323499999999912 | -0.572 |
| -0.320874999999912 | -0.572 |
| -0.318249999999912 | -0.573 |
| -0.315624999999912 | -0.573 |
| -0.312999999999912 | -0.574 |
| -0.310374999999912 | -0.574 |
| -0.307749999999912 | -0.575 |
| -0.305124999999912 | -0.575 |
| -0.302499999999912 | -0.575 |
| -0.299874999999912 | -0.576 |
| -0.297249999999912 | -0.576 |
| -0.294624999999912 | -0.577 |
| -0.291999999999912 | -0.577 |
| -0.289374999999912 | -0.577 |
| -0.286749999999912 | -0.578 |
| -0.284124999999912 | -0.578 |
| -0.281499999999912 | -0.578 |
| -0.278874999999912 | -0.579 |
| -0.276249999999912 | -0.579 |
| -0.273624999999912 | -0.58 |
| -0.270999999999912 | -0.58 |
| -0.268374999999912 | -0.58 |
| -0.265749999999912 | -0.581 |
| -0.263124999999912 | -0.581 |
| -0.260499999999912 | -0.581 |
| -0.257874999999912 | -0.582 |
| -0.255249999999912 | -0.582 |
| -0.252624999999912 | -0.582 |
| -0.249999999999912 | -0.583 |
| -0.247374999999912 | -0.583 |
| -0.244749999999912 | -0.583 |
| -0.242124999999912 | -0.584 |
| -0.239499999999912 | -0.584 |
| -0.236874999999912 | -0.584 |
| -0.234249999999912 | -0.585 |
| -0.231624999999912 | -0.585 |
| -0.228999999999912 | -0.585 |
| -0.226374999999912 | -0.586 |
| -0.223749999999912 | -0.586 |
| -0.221124999999912 | -0.586 |
| -0.218499999999912 | -0.587 |
| -0.215874999999912 | -0.587 |
| -0.213249999999912 | -0.587 |
| -0.210624999999912 | -0.588 |
| -0.207999999999912 | -0.588 |
| -0.205374999999912 | -0.588 |
| -0.202749999999912 | -0.589 |
| -0.200124999999913 | -0.589 |
| -0.197499999999912 | -0.589 |
| -0.194874999999913 | -0.589 |
| -0.192249999999913 | -0.59 |
| -0.189624999999913 | -0.59 |
| -0.186999999999913 | -0.59 |
| -0.184374999999913 | -0.59 |
| -0.181749999999913 | -0.591 |
| -0.179124999999913 | -0.591 |
| -0.176499999999913 | -0.591 |
| -0.173874999999913 | -0.591 |
| -0.171249999999913 | -0.592 |
| -0.168624999999913 | -0.592 |
| -0.165999999999913 | -0.592 |
| -0.163374999999913 | -0.592 |
| -0.160749999999913 | -0.593 |
| -0.158124999999913 | -0.593 |
| -0.155499999999913 | -0.593 |
| -0.152874999999913 | -0.593 |
| -0.150249999999913 | -0.594 |
| -0.147624999999913 | -0.594 |
| -0.144999999999913 | -0.594 |
| -0.142374999999913 | -0.594 |
| -0.139749999999913 | -0.594 |
| -0.137124999999913 | -0.595 |
| -0.134499999999913 | -0.595 |
| -0.131874999999913 | -0.595 |
| -0.129249999999913 | -0.595 |
| -0.126624999999913 | -0.595 |
| -0.123999999999913 | -0.596 |
| -0.121374999999913 | -0.596 |
| -0.118749999999913 | -0.596 |
| -0.116124999999913 | -0.596 |
| -0.113499999999913 | -0.596 |
| -0.110874999999913 | -0.596 |
| -0.108249999999913 | -0.597 |
| -0.105624999999913 | -0.597 |
| -0.102999999999913 | -0.597 |
| -0.100374999999913 | -0.597 |
| -0.0977499999999128 | -0.597 |
| -0.0951249999999128 | -0.597 |
| -0.0924999999999128 | -0.598 |
| -0.0898749999999128 | -0.598 |
| -0.0872499999999128 | -0.598 |
| -0.0846249999999128 | -0.598 |
| -0.0819999999999128 | -0.598 |
| -0.0793749999999128 | -0.598 |
| -0.0767499999999128 | -0.598 |
| -0.0741249999999128 | -0.598 |
| -0.0714999999999128 | -0.599 |
| -0.0688749999999128 | -0.599 |
| -0.0662499999999128 | -0.599 |
| -0.0636249999999128 | -0.599 |
| -0.0609999999999128 | -0.599 |
| -0.0583749999999128 | -0.599 |
| -0.0557499999999128 | -0.599 |
| -0.0531249999999128 | -0.599 |
| -0.0504999999999128 | -0.599 |
| -0.0478749999999128 | -0.599 |
| -0.0452499999999128 | -0.599 |
| -0.0426249999999128 | -0.599 |
| -0.0399999999999127 | -0.6 |
| -0.0373749999999127 | -0.6 |
| -0.0347499999999127 | -0.6 |
| -0.0321249999999127 | -0.6 |
| -0.0294999999999127 | -0.6 |
| -0.0268749999999127 | -0.6 |
| -0.0242499999999127 | -0.6 |
| -0.0216249999999128 | -0.6 |
| -0.0189999999999128 | -0.6 |
| -0.0163749999999128 | -0.6 |
| -0.0137499999999128 | -0.6 |
| -0.0111249999999128 | -0.6 |
| -0.00849999999991275 | -0.6 |
| -0.00587499999991275 | -0.6 |
| -0.00324999999991275 | -0.6 |
| -0.000624999999912755 | -0.6 |
| 0.00200000000008724 | -0.6 |
| 0.00462500000008724 | -0.6 |
| 0.00725000000008724 | -0.6 |
| 0.00987500000008724 | -0.6 |
| 0.0125000000000872 | -0.6 |
| 0.0151250000000872 | -0.6 |
| 0.0177500000000872 | -0.6 |
| 0.0203750000000872 | -0.6 |
| 0.0230000000000872 | -0.6 |
| 0.0256250000000872 | -0.6 |
| 0.0282500000000872 | -0.6 |
| 0.0308750000000872 | -0.6 |
| 0.0335000000000872 | -0.6 |
| 0.0361250000000872 | -0.6 |
| 0.0387500000000872 | -0.6 |
| 0.0413750000000872 | -0.599 |
| 0.0440000000000872 | -0.599 |
| 0.0466250000000872 | -0.599 |
| 0.0492500000000872 | -0.599 |
| 0.0518750000000873 | -0.599 |
| 0.0545000000000873 | -0.599 |
| 0.0571250000000873 | -0.599 |
| 0.0597500000000873 | -0.599 |
| 0.0623750000000873 | -0.599 |
| 0.0650000000000873 | -0.599 |
| 0.0676250000000873 | -0.599 |
| 0.0702500000000873 | -0.598 |
| 0.0728750000000873 | -0.598 |
| 0.0755000000000873 | -0.598 |
| 0.0781250000000873 | -0.598 |
| 0.0807500000000873 | -0.598 |
| 0.0833750000000873 | -0.598 |
| 0.0860000000000873 | -0.598 |
| 0.0886250000000873 | -0.598 |
| 0.0912500000000873 | -0.597 |
| 0.0938750000000873 | -0.597 |
| 0.0965000000000873 | -0.597 |
| 0.0991250000000873 | -0.597 |
| 0.101750000000087 | -0.597 |
| 0.104375000000087 | -0.597 |
| 0.107000000000087 | -0.596 |
| 0.109625000000087 | -0.596 |
| 0.112250000000087 | -0.596 |
| 0.114875000000087 | -0.596 |
| 0.117500000000087 | -0.596 |
| 0.120125000000087 | -0.595 |
| 0.122750000000087 | -0.595 |
| 0.125375000000087 | -0.595 |
| 0.128000000000087 | -0.595 |
| 0.130625000000087 | -0.595 |
| 0.133250000000087 | -0.594 |
| 0.135875000000087 | -0.594 |
| 0.138500000000087 | -0.594 |
| 0.141125000000087 | -0.594 |
| 0.143750000000087 | -0.594 |
| 0.146375000000087 | -0.593 |
| 0.149000000000087 | -0.593 |
| 0.151625000000087 | -0.593 |
| 0.154250000000087 | -0.592 |
| 0.156875000000087 | -0.592 |
| 0.159500000000087 | -0.592 |
| 0.162125000000087 | -0.592 |
| 0.164750000000087 | -0.591 |
| 0.167375000000087 | -0.591 |
| 0.170000000000087 | -0.591 |
| 0.172625000000087 | -0.591 |
| 0.175250000000087 | -0.59 |
| 0.177875000000087 | -0.59 |
| 0.180500000000087 | -0.59 |
| 0.183125000000087 | -0.589 |
| 0.185750000000087 | -0.589 |
| 0.188375000000087 | -0.589 |
| 0.191000000000087 | -0.588 |
| 0.193625000000087 | -0.588 |
| 0.196250000000087 | -0.588 |
| 0.198875000000087 | -0.587 |
| 0.201500000000087 | -0.587 |
| 0.204125000000087 | -0.587 |
| 0.206750000000087 | -0.586 |
| 0.209375000000087 | -0.586 |
| 0.212000000000087 | -0.586 |
| 0.214625000000087 | -0.585 |
| 0.217250000000087 | -0.585 |
| 0.219875000000087 | -0.584 |
| 0.222500000000087 | -0.584 |
| 0.225125000000087 | -0.584 |
| 0.227750000000087 | -0.583 |
| 0.230375000000087 | -0.583 |
| 0.233000000000087 | -0.582 |
| 0.235625000000087 | -0.582 |
| 0.238250000000087 | -0.582 |
| 0.240875000000087 | -0.581 |
| 0.243500000000087 | -0.581 |
| 0.246125000000087 | -0.58 |
| 0.248750000000087 | -0.58 |
| 0.251375000000087 | -0.579 |
| 0.254000000000087 | -0.579 |
| 0.256625000000087 | -0.579 |
| 0.259250000000087 | -0.578 |
| 0.261875000000087 | -0.578 |
| 0.264500000000087 | -0.577 |
| 0.267125000000087 | -0.577 |
| 0.269750000000087 | -0.576 |
| 0.272375000000087 | -0.576 |
| 0.275000000000087 | -0.575 |
| 0.277625000000087 | -0.575 |
| 0.280250000000087 | -0.574 |
| 0.282875000000087 | -0.574 |
| 0.285500000000087 | -0.573 |
| 0.288125000000087 | -0.573 |
| 0.290750000000087 | -0.572 |
| 0.293375000000087 | -0.572 |
| 0.296000000000087 | -0.571 |
| 0.298625000000087 | -0.571 |
| 0.301250000000087 | -0.57 |
| 0.303875000000087 | -0.569 |
| 0.306500000000086 | -0.569 |
| 0.309125000000086 | -0.568 |
| 0.311750000000086 | -0.568 |
| 0.314375000000086 | -0.567 |
| 0.317000000000086 | -0.567 |
| 0.319625000000086 | -0.566 |
| 0.322250000000086 | -0.566 |
| 0.324875000000086 | -0.565 |
| 0.327500000000086 | -0.564 |
| 0.330125000000086 | -0.564 |
| 0.332750000000086 | -0.563 |
| 0.335375000000086 | -0.562 |
| 0.338000000000086 | -0.562 |
| 0.340625000000086 | -0.561 |
| 0.343250000000086 | -0.561 |
| 0.345875000000086 | -0.56 |
| 0.348500000000086 | -0.559 |
| 0.351125000000086 | -0.559 |
| 0.353750000000086 | -0.558 |
| 0.356375000000086 | -0.557 |
| 0.359000000000086 | -0.557 |
| 0.361625000000086 | -0.556 |
| 0.364250000000086 | -0.555 |
| 0.366875000000086 | -0.555 |
| 0.369500000000086 | -0.554 |
| 0.372125000000086 | -0.553 |
| 0.374750000000086 | -0.553 |
| 0.377375000000086 | -0.552 |
| 0.380000000000086 | -0.551 |
| 0.382625000000086 | -0.55 |
| 0.385250000000086 | -0.55 |
| 0.387875000000086 | -0.549 |
| 0.390500000000086 | -0.548 |
| 0.393125000000086 | -0.548 |
| 0.395750000000086 | -0.547 |
| 0.398375000000086 | -0.546 |
| 0.401000000000086 | -0.545 |
| 0.403625000000086 | -0.545 |
| 0.406250000000086 | -0.544 |
| 0.408875000000086 | -0.543 |
| 0.411500000000086 | -0.542 |
| 0.414125000000086 | -0.541 |
| 0.416750000000086 | -0.541 |
| 0.419375000000086 | -0.54 |
| 0.422000000000086 | -0.539 |
| 0.424625000000086 | -0.538 |
| 0.427250000000086 | -0.537 |
| 0.429875000000086 | -0.537 |
| 0.432500000000086 | -0.536 |
| 0.435125000000086 | -0.535 |
| 0.437750000000086 | -0.534 |
| 0.440375000000086 | -0.533 |
| 0.443000000000086 | -0.532 |
| 0.445625000000086 | -0.532 |
| 0.448250000000086 | -0.531 |
| 0.450875000000086 | -0.53 |
| 0.453500000000086 | -0.529 |
| 0.456125000000086 | -0.528 |
| 0.458750000000086 | -0.527 |
| 0.461375000000086 | -0.526 |
| 0.464000000000086 | -0.525 |
| 0.466625000000086 | -0.525 |
| 0.469250000000086 | -0.524 |
| 0.471875000000086 | -0.523 |
| 0.474500000000086 | -0.522 |
| 0.477125000000086 | -0.521 |
| 0.479750000000086 | -0.52 |
| 0.482375000000086 | -0.519 |
| 0.485000000000086 | -0.518 |
| 0.487625000000086 | -0.517 |
| 0.490250000000086 | -0.516 |
| 0.492875000000086 | -0.515 |
| 0.495500000000086 | -0.514 |
| 0.498125000000086 | -0.513 |
| 0.500750000000086 | -0.512 |
| 0.503375000000086 | -0.511 |
| 0.506000000000086 | -0.51 |
| 0.508625000000086 | -0.509 |
| 0.511250000000086 | -0.508 |
| 0.513875000000086 | -0.507 |
| 0.516500000000086 | -0.506 |
| 0.519125000000086 | -0.505 |
| 0.521750000000086 | -0.504 |
| 0.524375000000086 | -0.503 |
| 0.527000000000086 | -0.502 |
| 0.529625000000086 | -0.501 |
| 0.532250000000086 | -0.5 |
| 0.534875000000086 | -0.499 |
| 0.537500000000086 | -0.498 |
| 0.540125000000086 | -0.497 |
| 0.542750000000086 | -0.496 |
| 0.545375000000086 | -0.495 |
| 0.548000000000086 | -0.493 |
| 0.550625000000086 | -0.492 |
| 0.553250000000085 | -0.491 |
| 0.555875000000085 | -0.49 |
| 0.558500000000085 | -0.489 |
| 0.561125000000085 | -0.488 |
| 0.563750000000085 | -0.487 |
| 0.566375000000085 | -0.486 |
| 0.569000000000085 | -0.484 |
| 0.571625000000085 | -0.483 |
| 0.574250000000085 | -0.482 |
| 0.576875000000085 | -0.481 |
| 0.579500000000085 | -0.48 |
| 0.582125000000085 | -0.479 |
| 0.584750000000085 | -0.477 |
| 0.587375000000085 | -0.476 |
| 0.590000000000085 | -0.475 |
| 0.592625000000085 | -0.474 |
| 0.595250000000085 | -0.473 |
| 0.597875000000085 | -0.471 |
| 0.600500000000085 | -0.47 |
| 0.603125000000085 | -0.469 |
| 0.605750000000085 | -0.468 |
| 0.608375000000085 | -0.466 |
| 0.611000000000085 | -0.465 |
| 0.613625000000085 | -0.464 |
| 0.616250000000085 | -0.463 |
| 0.618875000000085 | -0.461 |
| 0.621500000000085 | -0.46 |
| 0.624125000000085 | -0.459 |
| 0.626750000000085 | -0.458 |
| 0.629375000000085 | -0.456 |
| 0.632000000000085 | -0.455 |
| 0.634625000000085 | -0.454 |
| 0.637250000000085 | -0.452 |
| 0.639875000000085 | -0.451 |
| 0.642500000000085 | -0.45 |
| 0.645125000000085 | -0.448 |
| 0.647750000000085 | -0.447 |
| 0.650375000000085 | -0.446 |
| 0.653000000000085 | -0.444 |
| 0.655625000000085 | -0.443 |
| 0.658250000000085 | -0.441 |
| 0.660875000000085 | -0.44 |
| 0.663500000000085 | -0.439 |
| 0.666125000000085 | -0.437 |
| 0.668750000000085 | -0.436 |
| 0.671375000000085 | -0.435 |
| 0.674000000000085 | -0.433 |
| 0.676625000000085 | -0.432 |
| 0.679250000000085 | -0.43 |
| 0.681875000000085 | -0.429 |
| 0.684500000000085 | -0.427 |
| 0.687125000000085 | -0.426 |
| 0.689750000000085 | -0.424 |
| 0.692375000000085 | -0.423 |
| 0.695000000000085 | -0.422 |
| 0.697625000000085 | -0.42 |
| 0.700250000000085 | -0.419 |
| 0.702875000000085 | -0.417 |
| 0.705500000000085 | -0.416 |
| 0.708125000000085 | -0.414 |
| 0.710750000000085 | -0.413 |
| 0.713375000000085 | -0.411 |
| 0.716000000000085 | -0.409 |
| 0.718625000000085 | -0.408 |
| 0.721250000000085 | -0.406 |
| 0.723875000000085 | -0.405 |
| 0.726500000000085 | -0.403 |
| 0.729125000000085 | -0.402 |
| 0.731750000000085 | -0.4 |
| 0.734375000000085 | -0.399 |
| 0.737000000000085 | -0.397 |
| 0.739625000000085 | -0.395 |
| 0.742250000000085 | -0.394 |
| 0.744875000000085 | -0.392 |
| 0.747500000000085 | -0.391 |
| 0.750125000000085 | -0.389 |
| 0.752750000000085 | -0.387 |
| 0.755375000000085 | -0.386 |
| 0.758000000000085 | -0.384 |
| 0.760625000000085 | -0.382 |
| 0.763250000000085 | -0.381 |
| 0.765875000000084 | -0.379 |
| 0.768500000000084 | -0.377 |
| 0.771125000000084 | -0.376 |
| 0.773750000000084 | -0.374 |
| 0.776375000000084 | -0.372 |
| 0.779000000000084 | -0.371 |
| 0.781625000000084 | -0.369 |
| 0.784250000000084 | -0.367 |
| 0.786875000000084 | -0.366 |
| 0.789500000000084 | -0.364 |
| 0.792125000000084 | -0.362 |
| 0.794750000000084 | -0.36 |
| 0.797375000000084 | -0.359 |
| 0.800000000000084 | -0.357 |
| 0.802625000000084 | -0.355 |
| 0.805250000000084 | -0.353 |
| 0.807875000000084 | -0.351 |
| 0.810500000000084 | -0.35 |
| 0.813125000000084 | -0.348 |
| 0.815750000000084 | -0.346 |
| 0.818375000000084 | -0.344 |
| 0.821000000000084 | -0.342 |
| 0.823625000000084 | -0.341 |
| 0.826250000000084 | -0.339 |
| 0.828875000000084 | -0.337 |
| 0.831500000000084 | -0.335 |
| 0.834125000000084 | -0.333 |
| 0.836750000000084 | -0.331 |
| 0.839375000000084 | -0.329 |
| 0.842000000000084 | -0.328 |
| 0.844625000000084 | -0.326 |
| 0.847250000000084 | -0.324 |
| 0.849875000000084 | -0.322 |
| 0.852500000000084 | -0.32 |
| 0.855125000000084 | -0.318 |
| 0.857750000000084 | -0.316 |
| 0.860375000000084 | -0.314 |
| 0.863000000000084 | -0.312 |
| 0.865625000000084 | -0.31 |
| 0.868250000000084 | -0.308 |
| 0.870875000000084 | -0.306 |
| 0.873500000000084 | -0.304 |
| 0.876125000000084 | -0.302 |
| 0.878750000000084 | -0.3 |
| 0.881375000000084 | -0.298 |
| 0.884000000000084 | -0.296 |
| 0.886625000000084 | -0.294 |
| 0.889250000000084 | -0.292 |
| 0.891875000000084 | -0.29 |
| 0.894500000000084 | -0.288 |
| 0.897125000000084 | -0.286 |
| 0.899750000000084 | -0.284 |
| 0.902375000000084 | -0.282 |
| 0.905000000000084 | -0.28 |
| 0.907625000000084 | -0.278 |
| 0.910250000000084 | -0.276 |
| 0.912875000000084 | -0.274 |
| 0.915500000000084 | -0.272 |
| 0.918125000000084 | -0.27 |
| 0.920750000000084 | -0.268 |
| 0.923375000000084 | -0.265 |
| 0.926000000000084 | -0.263 |
| 0.928625000000084 | -0.261 |
| 0.931250000000084 | -0.259 |
| 0.933875000000084 | -0.257 |
| 0.936500000000084 | -0.255 |
| 0.939125000000084 | -0.253 |
| 0.941750000000084 | -0.25 |
| 0.944375000000084 | -0.248 |
| 0.947000000000084 | -0.246 |
| 0.949625000000084 | -0.244 |
| 0.952250000000084 | -0.242 |
| 0.954875000000084 | -0.239 |
| 0.957500000000084 | -0.237 |
| 0.960125000000084 | -0.235 |
| 0.962750000000084 | -0.233 |
| 0.965375000000084 | -0.23 |
| 0.968000000000084 | -0.228 |
| 0.970625000000084 | -0.226 |
| 0.973250000000084 | -0.224 |
| 0.975875000000084 | -0.221 |
| 0.978500000000084 | -0.219 |
| 0.981125000000084 | -0.217 |
| 0.983750000000084 | -0.214 |
| 0.986375000000084 | -0.212 |
| 0.989000000000084 | -0.21 |
| 0.991625000000084 | -0.207 |
| 0.994250000000084 | -0.205 |
| 0.996875000000084 | -0.203 |
| 0.999500000000083 | -0.2 |
| 1.002125000000084 | -0.198 |
| 1.004750000000084 | -0.196 |
| 1.007375000000084 | -0.193 |
| 1.010000000000084 | -0.191 |
| 1.012625000000084 | -0.189 |
| 1.015250000000084 | -0.186 |
| 1.017875000000084 | -0.184 |
| 1.020500000000084 | -0.181 |
| 1.023125000000084 | -0.179 |
| 1.025750000000085 | -0.176 |
| 1.028375000000085 | -0.174 |
| 1.031000000000085 | -0.172 |
| 1.033625000000085 | -0.169 |
| 1.036250000000085 | -0.167 |
| 1.038875000000085 | -0.164 |
| 1.041500000000085 | -0.162 |
| 1.044125000000085 | -0.159 |
| 1.046750000000085 | -0.157 |
| 1.049375000000085 | -0.154 |
| 1.052000000000086 | -0.152 |
| 1.054625000000086 | -0.149 |
| 1.057250000000086 | -0.146 |
| 1.059875000000086 | -0.144 |
| 1.062500000000086 | -0.141 |
| 1.065125000000086 | -0.139 |
| 1.067750000000086 | -0.136 |
| 1.070375000000086 | -0.134 |
| 1.073000000000086 | -0.131 |
| 1.075625000000086 | -0.128 |
| 1.078250000000087 | -0.126 |
| 1.080875000000087 | -0.123 |
| 1.083500000000087 | -0.121 |
| 1.086125000000087 | -0.118 |
| 1.088750000000087 | -0.115 |
| 1.091375000000087 | -0.113 |
| 1.094000000000087 | -0.11 |
| 1.096625000000087 | -0.107 |
| 1.099250000000087 | -0.105 |
| 1.101875000000087 | -0.102 |
| 1.104500000000088 | -0.099 |
| 1.107125000000088 | -0.097 |
| 1.109750000000088 | -0.094 |
| 1.112375000000088 | -0.091 |
| 1.115000000000088 | -0.088 |
| 1.117625000000088 | -0.086 |
| 1.120250000000088 | -0.083 |
| 1.122875000000088 | -0.08 |
| 1.125500000000088 | -0.077 |
| 1.128125000000088 | -0.075 |
| 1.130750000000089 | -0.072 |
| 1.133375000000089 | -0.069 |
| 1.136000000000089 | -0.066 |
| 1.138625000000089 | -0.063 |
| 1.141250000000089 | -0.061 |
| 1.14387500000009 | -0.058 |
| 1.14650000000009 | -0.055 |
| 1.149125000000089 | -0.052 |
| 1.151750000000089 | -0.049 |
| 1.154375000000089 | -0.046 |
| 1.157000000000089 | -0.044 |
| 1.15962500000009 | -0.041 |
| 1.16225000000009 | -0.038 |
| 1.16487500000009 | -0.035 |
| 1.16750000000009 | -0.032 |
| 1.17012500000009 | -0.029 |
| 1.17275000000009 | -0.026 |
| 1.17537500000009 | -0.023 |
| 1.17800000000009 | -0.02 |
| 1.18062500000009 | -0.017 |
| 1.18325000000009 | -0.014 |
| 1.185875000000091 | -0.011 |
| 1.188500000000091 | -0.008 |
| 1.191125000000091 | -0.005 |
| 1.193750000000091 | -0.002 |
| 1.196375000000091 | 0.001 |
| 1.199000000000091 | 0.004 |
| 1.201625000000091 | 0.007 |
| 1.204250000000091 | 0.01 |
| 1.206875000000091 | 0.013 |
| 1.209500000000091 | 0.016 |
| 1.212125000000092 | 0.019 |
| 1.214750000000092 | 0.022 |
| 1.217375000000092 | 0.025 |
| 1.220000000000092 | 0.028 |
| 1.222625000000092 | 0.031 |
| 1.225250000000092 | 0.034 |
| 1.227875000000092 | 0.037 |
| 1.230500000000092 | 0.041 |
| 1.233125000000092 | 0.044 |
| 1.235750000000092 | 0.047 |
| 1.238375000000093 | 0.05 |
| 1.241000000000093 | 0.053 |
| 1.243625000000093 | 0.056 |
| 1.246250000000093 | 0.06 |
| 1.248875000000093 | 0.063 |
| 1.251500000000093 | 0.066 |
| 1.254125000000093 | 0.069 |
| 1.256750000000093 | 0.072 |
| 1.259375000000093 | 0.076 |
| 1.262000000000093 | 0.079 |
| 1.264625000000094 | 0.082 |
| 1.267250000000094 | 0.085 |
| 1.269875000000094 | 0.089 |
| 1.272500000000094 | 0.092 |
| 1.275125000000094 | 0.095 |
| 1.277750000000094 | 0.098 |
| 1.280375000000094 | 0.102 |
| 1.283000000000094 | 0.105 |
| 1.285625000000094 | 0.108 |
| 1.288250000000094 | 0.112 |
| 1.290875000000095 | 0.115 |
| 1.293500000000095 | 0.118 |
| 1.296125000000095 | 0.122 |
| 1.298750000000095 | 0.125 |
| 1.301375000000095 | 0.128 |
| 1.304000000000095 | 0.132 |
| 1.306625000000095 | 0.135 |
| 1.309250000000095 | 0.139 |
| 1.311875000000095 | 0.142 |
| 1.314500000000095 | 0.146 |
| 1.317125000000096 | 0.149 |
| 1.319750000000096 | 0.152 |
| 1.322375000000096 | 0.156 |
| 1.325000000000096 | 0.159 |
| 1.327625000000096 | 0.163 |
| 1.330250000000096 | 0.166 |
| 1.332875000000096 | 0.17 |
| 1.335500000000096 | 0.173 |
| 1.338125000000096 | 0.177 |
| 1.340750000000096 | 0.18 |
| 1.343375000000097 | 0.184 |
| 1.346000000000097 | 0.187 |
| 1.348625000000097 | 0.191 |
| 1.351250000000097 | 0.194 |
| 1.353875000000097 | 0.198 |
| 1.356500000000097 | 0.202 |
| 1.359125000000097 | 0.205 |
| 1.361750000000097 | 0.209 |
| 1.364375000000097 | 0.212 |
| 1.367000000000097 | 0.216 |
| 1.369625000000098 | 0.22 |
| 1.372250000000098 | 0.223 |
| 1.374875000000098 | 0.227 |
| 1.377500000000098 | 0.231 |
| 1.380125000000098 | 0.234 |
| 1.382750000000098 | 0.238 |
| 1.385375000000098 | 0.242 |
| 1.388000000000098 | 0.245 |
| 1.390625000000098 | 0.249 |
| 1.393250000000098 | 0.253 |
| 1.395875000000098 | 0.257 |
| 1.398500000000099 | 0.26 |
| 1.401125000000099 | 0.264 |
| 1.403750000000099 | 0.268 |
| 1.406375000000099 | 0.272 |
| 1.409000000000099 | 0.275 |
| 1.411625000000099 | 0.279 |
| 1.414250000000099 | 0.283 |
| 1.416875000000099 | 0.287 |
| 1.419500000000099 | 0.291 |
| 1.4221250000001 | 0.294 |
| 1.4247500000001 | 0.298 |
| 1.4273750000001 | 0.302 |
| 1.4300000000001 | 0.306 |
| 1.4326250000001 | 0.31 |
| 1.4352500000001 | 0.314 |
| 1.4378750000001 | 0.318 |
| 1.4405000000001 | 0.321 |
| 1.4431250000001 | 0.325 |
| 1.4457500000001 | 0.329 |
| 1.448375000000101 | 0.333 |
| 1.451000000000101 | 0.337 |
| 1.453625000000101 | 0.341 |
| 1.456250000000101 | 0.345 |
| 1.458875000000101 | 0.349 |
| 1.461500000000101 | 0.353 |
| 1.464125000000101 | 0.357 |
| 1.466750000000101 | 0.361 |
| 1.469375000000101 | 0.365 |
| 1.472000000000101 | 0.369 |
| 1.474625000000102 | 0.373 |
| 1.477250000000102 | 0.377 |
| 1.479875000000102 | 0.381 |
| 1.482500000000102 | 0.385 |
| 1.485125000000102 | 0.389 |
| 1.487750000000102 | 0.393 |
| 1.490375000000102 | 0.397 |
| 1.493000000000102 | 0.402 |
| 1.495625000000102 | 0.406 |
| 1.498250000000102 | 0.41 |
| 1.500875000000103 | 0.414 |
| 1.503500000000103 | 0.418 |
| 1.506125000000103 | 0.422 |
| 1.508750000000103 | 0.426 |
| 1.511375000000103 | 0.431 |
| 1.514000000000103 | 0.435 |
| 1.516625000000103 | 0.439 |
| 1.519250000000103 | 0.443 |
| 1.521875000000103 | 0.447 |
| 1.524500000000103 | 0.452 |
| 1.527125000000104 | 0.456 |
| 1.529750000000104 | 0.46 |
| 1.532375000000104 | 0.464 |
| 1.535000000000104 | 0.469 |
| 1.537625000000104 | 0.473 |
| 1.540250000000104 | 0.477 |
| 1.542875000000104 | 0.481 |
| 1.545500000000104 | 0.486 |
| 1.548125000000104 | 0.49 |
| 1.550750000000104 | 0.494 |
| 1.553375000000105 | 0.499 |
| 1.556000000000105 | 0.503 |
| 1.558625000000105 | 0.507 |
| 1.561250000000105 | 0.512 |
| 1.563875000000105 | 0.516 |
| 1.566500000000105 | 0.521 |
| 1.569125000000105 | 0.525 |
| 1.571750000000105 | 0.529 |
| 1.574375000000105 | 0.534 |
| 1.577000000000105 | 0.538 |
| 1.579625000000106 | 0.543 |
| 1.582250000000106 | 0.547 |
| 1.584875000000106 | 0.552 |
| 1.587500000000106 | 0.556 |
| 1.590125000000106 | 0.561 |
| 1.592750000000106 | 0.565 |
| 1.595375000000106 | 0.57 |
| 1.598000000000106 | 0.574 |
| 1.600625000000106 | 0.579 |
| 1.603250000000106 | 0.583 |
| 1.605875000000106 | 0.588 |
| 1.608500000000107 | 0.592 |
| 1.611125000000107 | 0.597 |
| 1.613750000000107 | 0.602 |
| 1.616375000000107 | 0.606 |
| 1.619000000000107 | 0.611 |
| 1.621625000000107 | 0.615 |
| 1.624250000000107 | 0.62 |
| 1.626875000000107 | 0.625 |
| 1.629500000000107 | 0.629 |
| 1.632125000000107 | 0.634 |
| 1.634750000000108 | 0.639 |
| 1.637375000000108 | 0.643 |
| 1.640000000000108 | 0.648 |
| 1.642625000000108 | 0.653 |
| 1.645250000000108 | 0.657 |
| 1.647875000000108 | 0.662 |
| 1.650500000000108 | 0.667 |
| 1.653125000000108 | 0.672 |
| 1.655750000000108 | 0.676 |
| 1.658375000000108 | 0.681 |
| 1.661000000000109 | 0.686 |
| 1.663625000000109 | 0.691 |
| 1.666250000000109 | 0.696 |
| 1.668875000000109 | 0.7 |
| 1.671500000000109 | 0.705 |
| 1.67412500000011 | 0.71 |
| 1.67675000000011 | 0.715 |
| 1.679375000000109 | 0.72 |
| 1.682000000000109 | 0.725 |
| 1.684625000000109 | 0.729 |
| 1.68725000000011 | 0.734 |
| 1.68987500000011 | 0.739 |
| 1.69250000000011 | 0.744 |
| 1.69512500000011 | 0.749 |
| 1.69775000000011 | 0.754 |
| 1.70037500000011 | 0.759 |
| 1.70300000000011 | 0.764 |
| 1.70562500000011 | 0.769 |
| 1.70825000000011 | 0.774 |
| 1.71087500000011 | 0.779 |
| 1.713500000000111 | 0.784 |
| 1.716125000000111 | 0.789 |
| 1.718750000000111 | 0.794 |
| 1.721375000000111 | 0.799 |
| 1.724000000000111 | 0.804 |
| 1.726625000000111 | 0.809 |
| 1.729250000000111 | 0.814 |
| 1.731875000000111 | 0.819 |
| 1.734500000000111 | 0.824 |
| 1.737125000000111 | 0.829 |
| 1.739750000000112 | 0.835 |
| 1.742375000000112 | 0.84 |
| 1.745000000000112 | 0.845 |
| 1.747625000000112 | 0.85 |
| 1.750250000000112 | 0.855 |
| 1.752875000000112 | 0.86 |
| 1.755500000000112 | 0.866 |
| 1.758125000000112 | 0.871 |
| 1.760750000000112 | 0.876 |
| 1.763375000000112 | 0.881 |
| 1.766000000000113 | 0.886 |
| 1.768625000000113 | 0.892 |
| 1.771250000000113 | 0.897 |
| 1.773875000000113 | 0.902 |
| 1.776500000000113 | 0.907 |
| 1.779125000000113 | 0.913 |
| 1.781750000000113 | 0.918 |
| 1.784375000000113 | 0.923 |
| 1.787000000000113 | 0.929 |
| 1.789625000000113 | 0.934 |
| 1.792250000000113 | 0.939 |
| 1.794875000000114 | 0.945 |
| 1.797500000000114 | 0.95 |
| 1.800125000000114 | 0.955 |
| 1.802750000000114 | 0.961 |
| 1.805375000000114 | 0.966 |
| 1.808000000000114 | 0.972 |
| 1.810625000000114 | 0.977 |
| 1.813250000000114 | 0.983 |
| 1.815875000000114 | 0.988 |
| 1.818500000000115 | 0.993 |
| 1.821125000000115 | 0.999 |
| 1.823750000000115 | 1.004 |
| 1.826375000000115 | 1.01 |
| 1.829000000000115 | 1.015 |
| 1.831625000000115 | 1.021 |
| 1.834250000000115 | 1.026 |
| 1.836875000000115 | 1.032 |
| 1.839500000000115 | 1.038 |
| 1.842125000000115 | 1.043 |
| 1.844750000000116 | 1.049 |
| 1.847375000000116 | 1.054 |
| 1.850000000000116 | 1.06 |